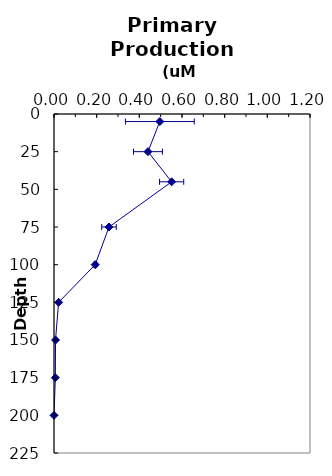
| Category | Series 0 |
|---|---|
| 0.496109945873447 | 5 |
| 0.44051124307461 | 25 |
| 0.551405331780558 | 45 |
| 0.257792783263382 | 75 |
| 0.193027744783791 | 100 |
| 0.0216770367527071 | 125 |
| 0.00710828600342596 | 150 |
| 0.00634349644724209 | 175 |
| 0.0 | 200 |